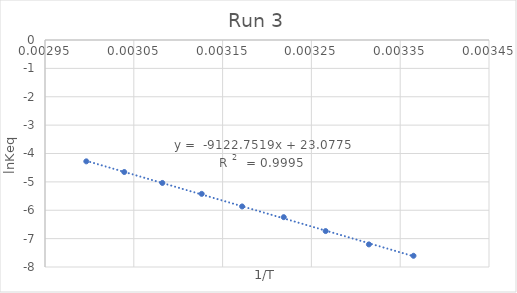
| Category | SINEt repeat-2 |
|---|---|
| 0.003364963994885255 | -7.605 |
| 0.003314770617873243 | -7.203 |
| 0.0032660526487686982 | -6.734 |
| 0.0032188495831589788 | -6.244 |
| 0.003171985028230667 | -5.866 |
| 0.0031264655307175235 | -5.423 |
| 0.0030821390044691015 | -5.038 |
| 0.0030392365437802026 | -4.652 |
| 0.002996524032122737 | -4.276 |